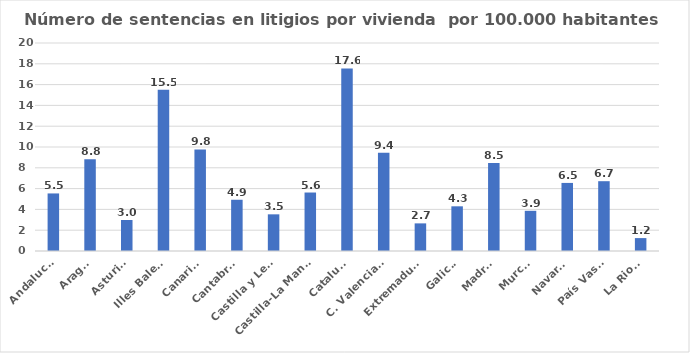
| Category | Número de sentencias en litigios por vivienda  por 100.000 habitantes |
|---|---|
| Andalucía | 5.535 |
| Aragón | 8.819 |
| Asturias | 2.98 |
| Illes Balears | 15.496 |
| Canarias | 9.761 |
| Cantabria | 4.928 |
| Castilla y León | 3.526 |
| Castilla-La Mancha | 5.623 |
| Cataluña | 17.559 |
| C. Valenciana | 9.448 |
| Extremadura | 2.656 |
| Galicia | 4.297 |
| Madrid | 8.454 |
| Murcia | 3.864 |
| Navarra | 6.546 |
| País Vasco | 6.712 |
| La Rioja | 1.241 |